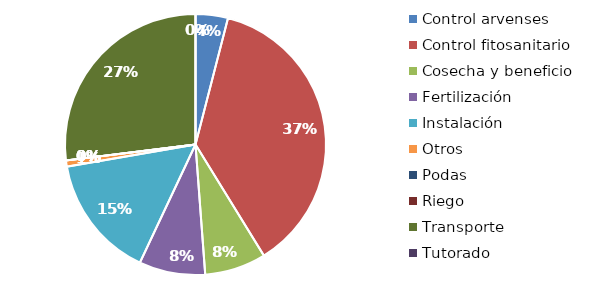
| Category | Valor |
|---|---|
| Control arvenses | 209415 |
| Control fitosanitario | 1945189 |
| Cosecha y beneficio | 396947.629 |
| Fertilización | 428209 |
| Instalación | 798857.104 |
| Otros | 39695 |
| Podas | 0 |
| Riego | 0 |
| Transporte | 1409162 |
| Tutorado | 0 |